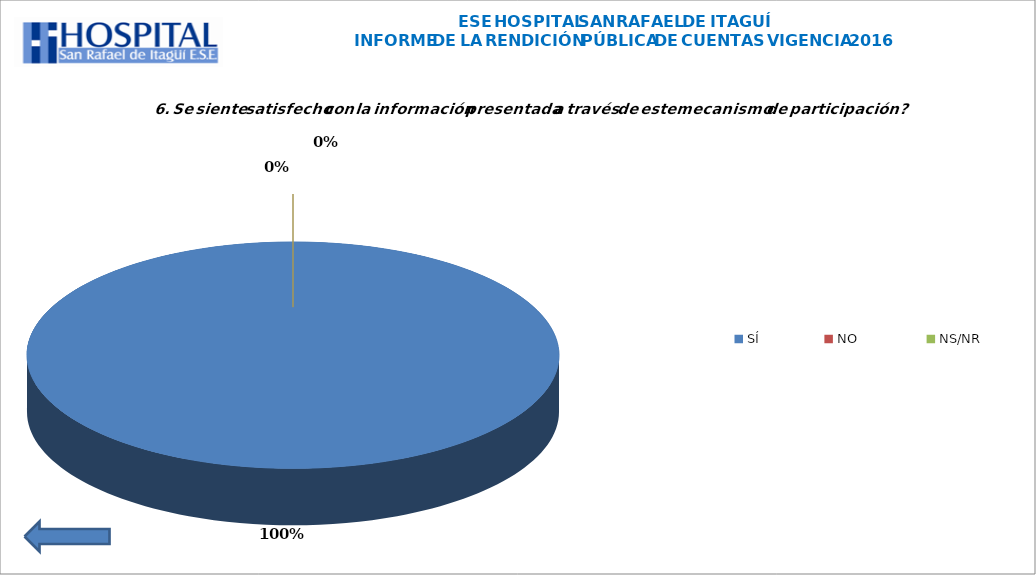
| Category | Series 0 |
|---|---|
| SÍ | 43 |
| NO  | 0 |
| NS/NR | 0 |